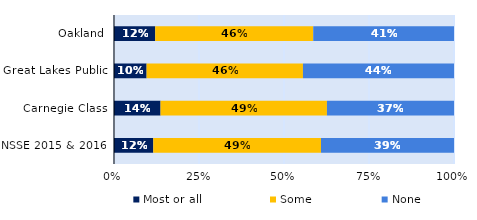
| Category | Most or all | Some | None |
|---|---|---|---|
| Oakland | 0.121 | 0.465 | 0.414 |
| Great Lakes Public | 0.096 | 0.46 | 0.444 |
| Carnegie Class | 0.137 | 0.489 | 0.374 |
| NSSE 2015 & 2016 | 0.116 | 0.493 | 0.391 |